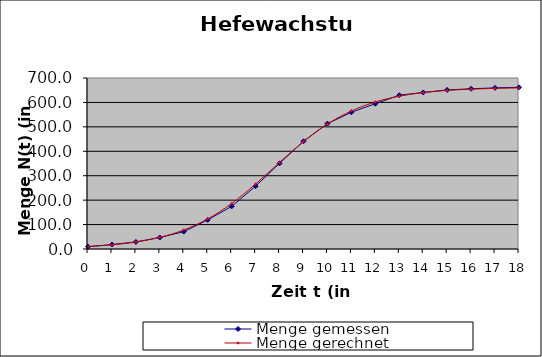
| Category | Menge gemessen | Menge gerechnet |
|---|---|---|
| 0.0 | 9.6 | 10 |
| 1.0 | 18.3 | 16.976 |
| 2.0 | 29 | 28.606 |
| 3.0 | 47.2 | 47.616 |
| 4.0 | 71.1 | 77.707 |
| 5.0 | 119.1 | 123.007 |
| 6.0 | 174.6 | 186.296 |
| 7.0 | 257.3 | 266.073 |
| 8.0 | 350.7 | 354.551 |
| 9.0 | 441 | 439.77 |
| 10.0 | 513.3 | 511.402 |
| 11.0 | 559.7 | 565.035 |
| 12.0 | 594.8 | 601.816 |
| 13.0 | 629.4 | 625.545 |
| 14.0 | 640.8 | 640.256 |
| 15.0 | 651.1 | 649.153 |
| 16.0 | 655.9 | 654.452 |
| 17.0 | 659.6 | 657.58 |
| 18.0 | 661.8 | 659.417 |